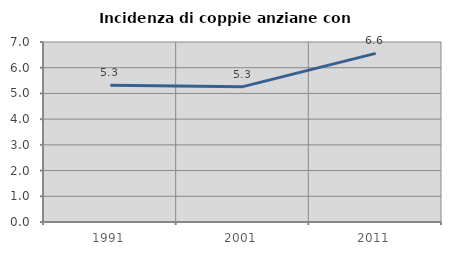
| Category | Incidenza di coppie anziane con figli |
|---|---|
| 1991.0 | 5.319 |
| 2001.0 | 5.263 |
| 2011.0 | 6.557 |